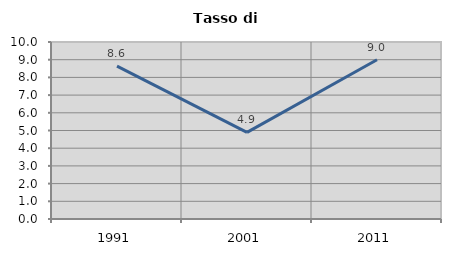
| Category | Tasso di disoccupazione   |
|---|---|
| 1991.0 | 8.637 |
| 2001.0 | 4.894 |
| 2011.0 | 8.997 |